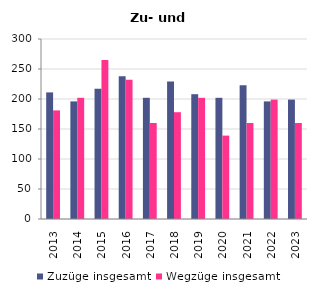
| Category | Zuzüge insgesamt | Wegzüge insgesamt |
|---|---|---|
| 2013.0 | 211 | 181 |
| 2014.0 | 196 | 202 |
| 2015.0 | 217 | 265 |
| 2016.0 | 238 | 232 |
| 2017.0 | 202 | 160 |
| 2018.0 | 229 | 178 |
| 2019.0 | 208 | 202 |
| 2020.0 | 202 | 139 |
| 2021.0 | 223 | 160 |
| 2022.0 | 196 | 199 |
| 2023.0 | 199 | 160 |